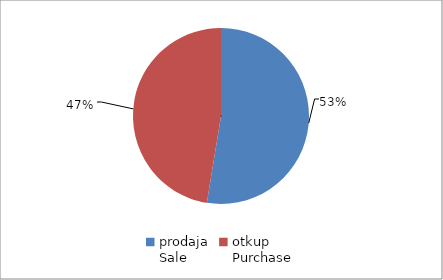
| Category | Series 0 |
|---|---|
| prodaja
Sale | 111895061.57 |
| otkup
Purchase | 100958178.1 |